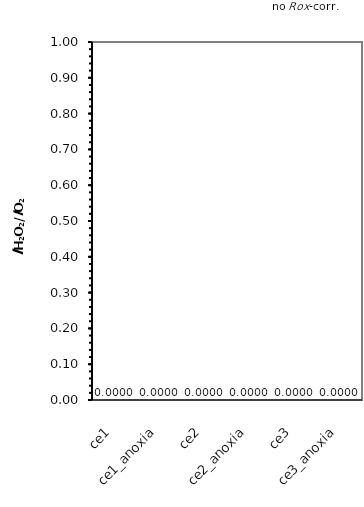
| Category | ce1 |
|---|---|
| ce1 | 0 |
| ce1_anoxia | 0 |
| ce2 | 0 |
| ce2_anoxia | 0 |
| ce3 | 0 |
| ce3_anoxia | 0 |